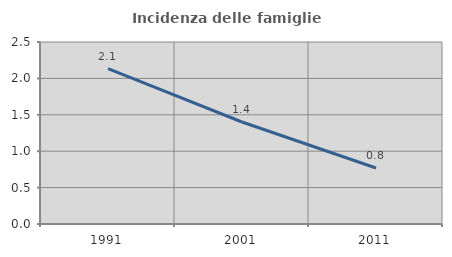
| Category | Incidenza delle famiglie numerose |
|---|---|
| 1991.0 | 2.134 |
| 2001.0 | 1.401 |
| 2011.0 | 0.769 |